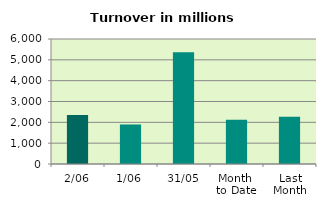
| Category | Series 0 |
|---|---|
| 2/06 | 2350.115 |
| 1/06 | 1897.391 |
| 31/05 | 5368.24 |
| Month 
to Date | 2123.753 |
| Last
Month | 2265.206 |